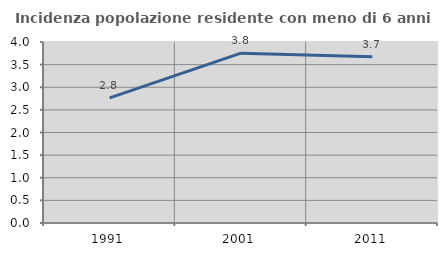
| Category | Incidenza popolazione residente con meno di 6 anni |
|---|---|
| 1991.0 | 2.767 |
| 2001.0 | 3.752 |
| 2011.0 | 3.672 |